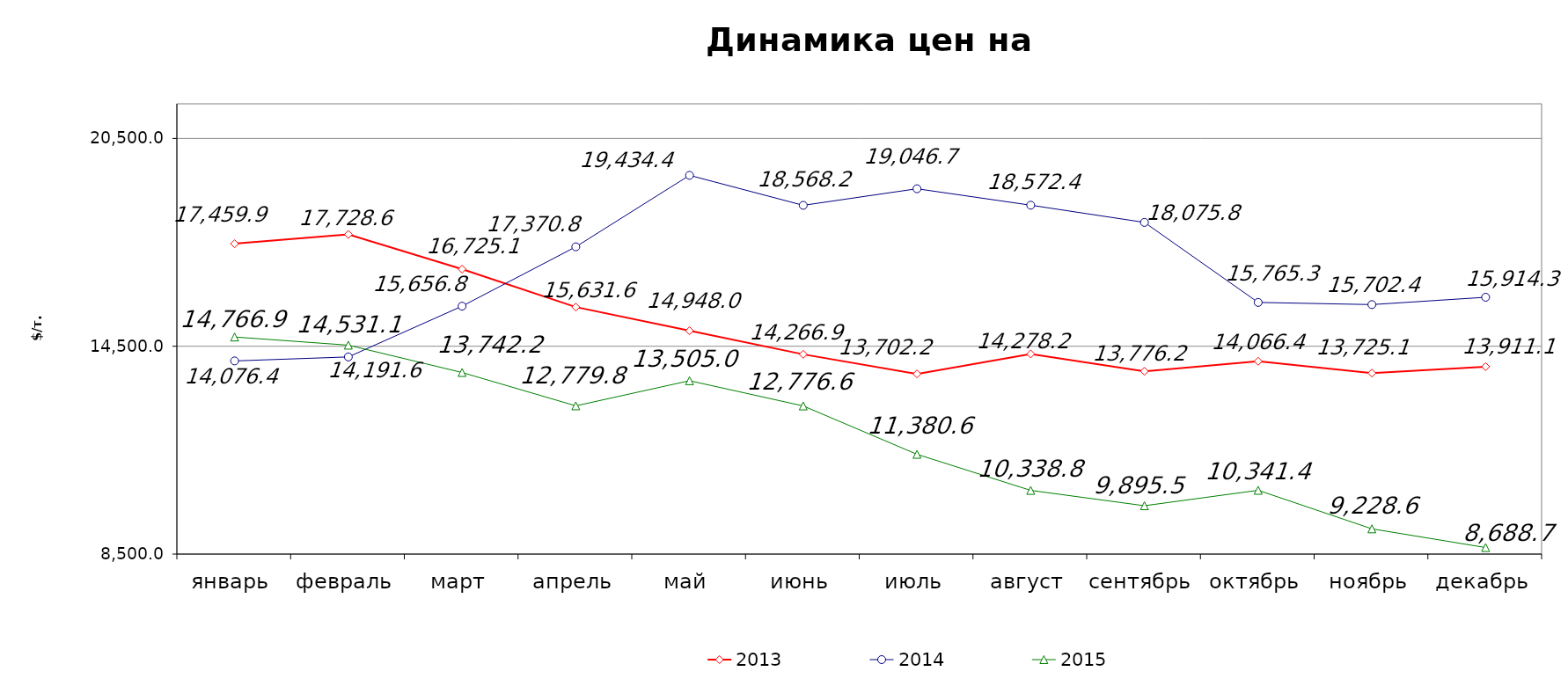
| Category | 2013 | 2014 | 2015 |
|---|---|---|---|
| январь | 17459.886 | 14076.37 | 14766.91 |
| февраль | 17728.625 | 14191.63 | 14531.125 |
| март | 16725.13 | 15656.79 | 13742.161 |
| апрель | 15631.55 | 17370.75 | 12779.75 |
| май | 14947.98 | 19434.38 | 13504.999 |
| июнь | 14266.875 | 18568.22 | 12776.591 |
| июль | 13702.175 | 19046.737 | 11380.55 |
| август | 14278.22 | 18572.375 | 10338.75 |
| сентябрь | 13776.19 | 18075.8 | 9895.46 |
| октябрь | 14066.41 | 15765.33 | 10341.37 |
| ноябрь | 13725.12 | 15702.38 | 9228.571 |
| декабрь | 13911.125 | 15914.29 | 8688.691 |